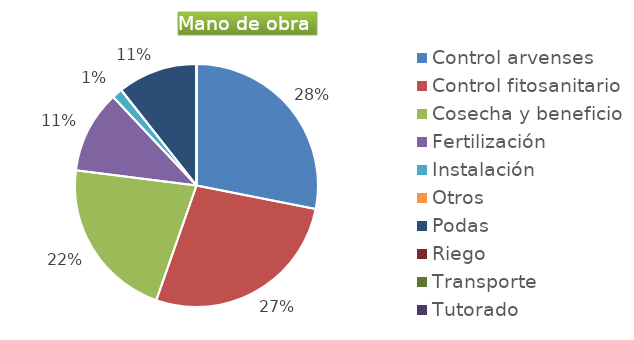
| Category | Series 0 |
|---|---|
| Control arvenses | 27456600 |
| Control fitosanitario | 26637000 |
| Cosecha y beneficio | 21137874.286 |
| Fertilización | 10723100 |
| Instalación | 1366000 |
| Otros | 0 |
| Podas | 10381600 |
| Riego | 0 |
| Transporte | 0 |
| Tutorado | 0 |